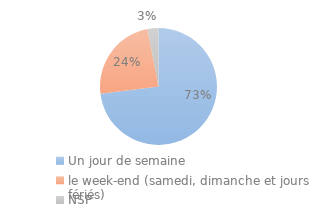
| Category | Series 0 |
|---|---|
| Un jour de semaine | 0.73 |
| le week-end (samedi, dimanche et jours fériés) | 0.24 |
| NSP | 0.03 |